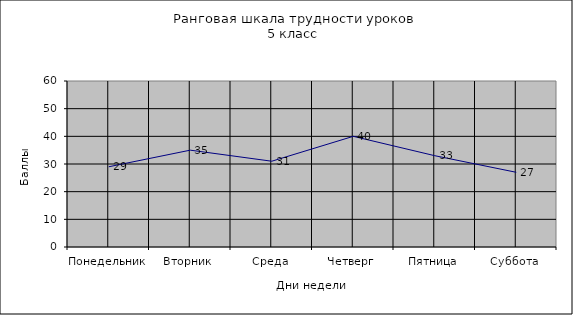
| Category | Series 0 |
|---|---|
| Понедельник | 29 |
| Вторник | 35 |
| Среда | 31 |
| Четверг | 40 |
| Пятница | 33 |
| Суббота | 27 |